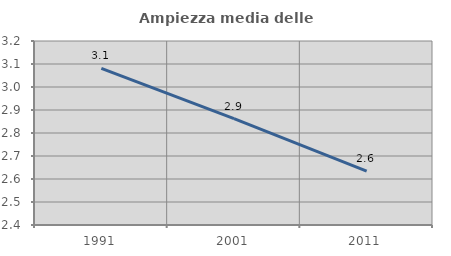
| Category | Ampiezza media delle famiglie |
|---|---|
| 1991.0 | 3.081 |
| 2001.0 | 2.863 |
| 2011.0 | 2.634 |